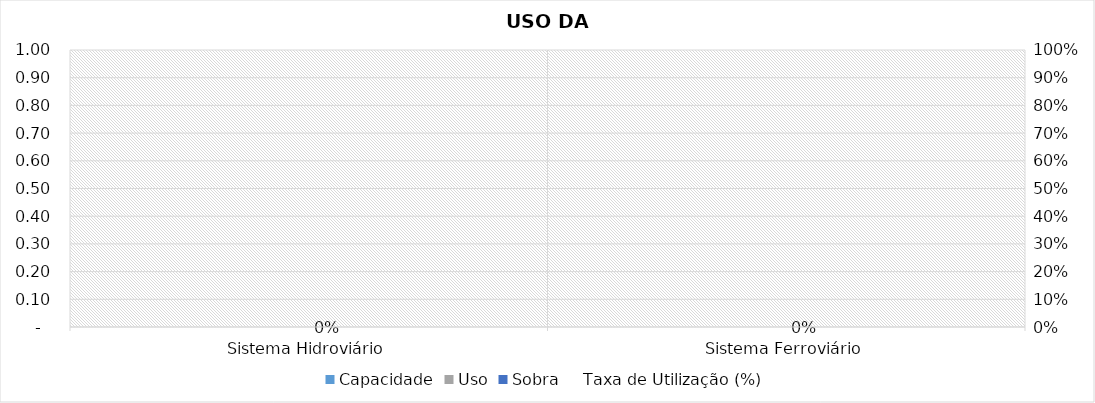
| Category | Capacidade | Uso | Sobra |
|---|---|---|---|
| Sistema Hidroviário | 0 | 0 | 0 |
| Sistema Ferroviário | 0 | 0 | 0 |